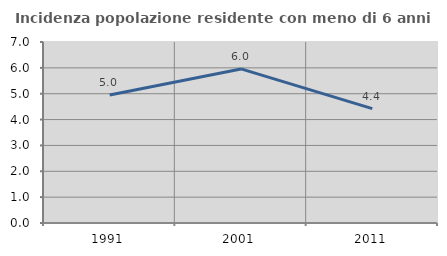
| Category | Incidenza popolazione residente con meno di 6 anni |
|---|---|
| 1991.0 | 4.953 |
| 2001.0 | 5.959 |
| 2011.0 | 4.425 |